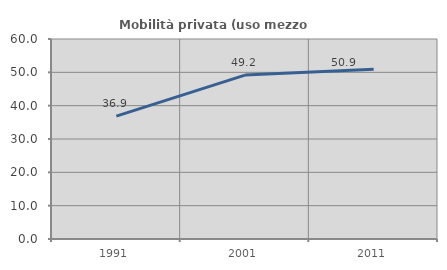
| Category | Mobilità privata (uso mezzo privato) |
|---|---|
| 1991.0 | 36.876 |
| 2001.0 | 49.176 |
| 2011.0 | 50.933 |